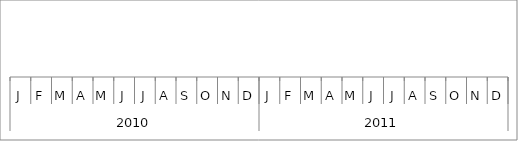
| Category | Series 0 |
|---|---|
| 0 | 6 |
| 1 | 6 |
| 2 | 5 |
| 3 | 6 |
| 4 | 8 |
| 5 | 10 |
| 6 | 6 |
| 7 | 10 |
| 8 | 5 |
| 9 | 10 |
| 10 | 6 |
| 11 | 6 |
| 12 | 5 |
| 13 | 6 |
| 14 | 8 |
| 15 | 8 |
| 16 | 9 |
| 17 | 8 |
| 18 | 5 |
| 19 | 10 |
| 20 | 8 |
| 21 | 10 |
| 22 | 7 |
| 23 | 9 |